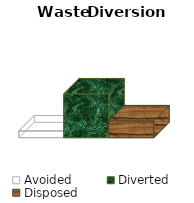
| Category | Avoided | Diverted | Disposed |
|---|---|---|---|
| 0 | 0.1 | 0.65 | 0.25 |